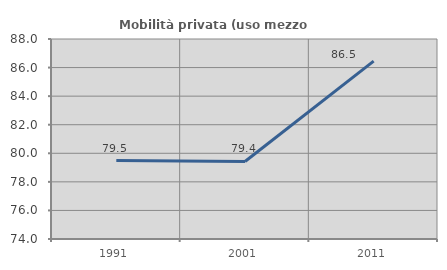
| Category | Mobilità privata (uso mezzo privato) |
|---|---|
| 1991.0 | 79.49 |
| 2001.0 | 79.425 |
| 2011.0 | 86.454 |